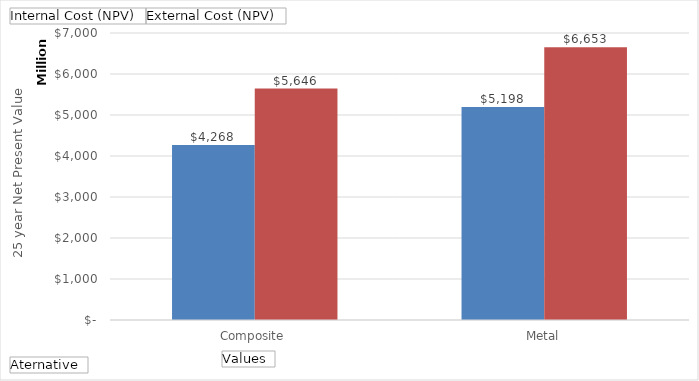
| Category | Internal Cost (NPV) | External Cost (NPV) |
|---|---|---|
| Composite | 4268362667.592 | 5645560616.599 |
| Metal | 5198100989.72 | 6653111772.134 |